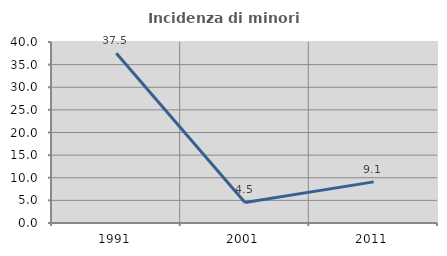
| Category | Incidenza di minori stranieri |
|---|---|
| 1991.0 | 37.5 |
| 2001.0 | 4.545 |
| 2011.0 | 9.091 |